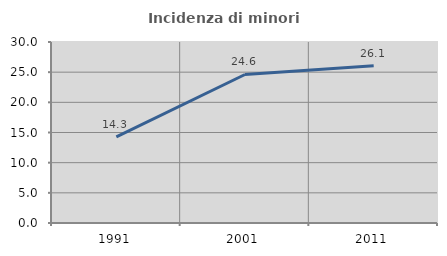
| Category | Incidenza di minori stranieri |
|---|---|
| 1991.0 | 14.286 |
| 2001.0 | 24.615 |
| 2011.0 | 26.054 |